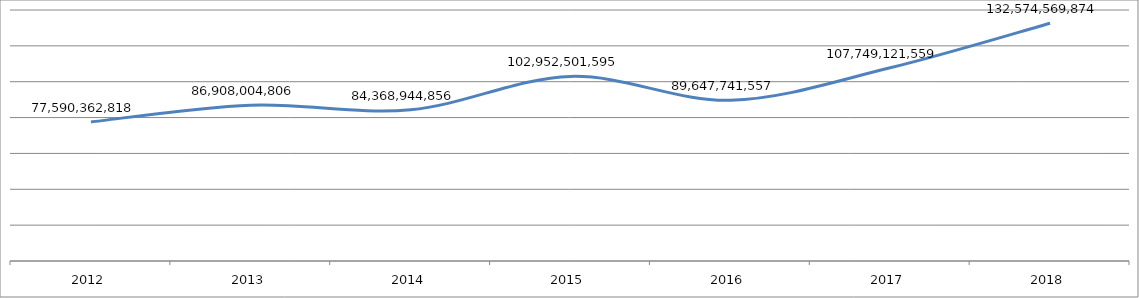
| Category | Series 0 |
|---|---|
| 2012.0 | 77590362818 |
| 2013.0 | 86908004806 |
| 2014.0 | 84368944856 |
| 2015.0 | 102952501595 |
| 2016.0 | 89647741557 |
| 2017.0 | 107749121559 |
| 2018.0 | 132574569874 |